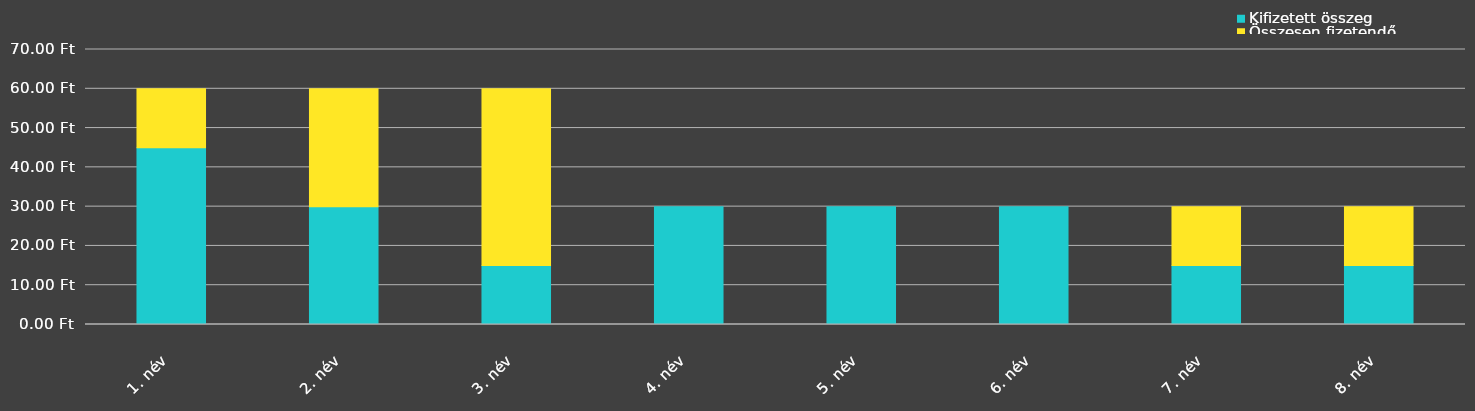
| Category | Kifizetett összeg | Összesen fizetendő |
|---|---|---|
| 1. név | 45 | 15 |
| 2. név | 30 | 30 |
| 3. név | 15 | 45 |
| 4. név | 30 | 0 |
| 5. név | 30 | 0 |
| 6. név | 30 | 0 |
| 7. név | 15 | 15 |
| 8. név | 15 | 15 |